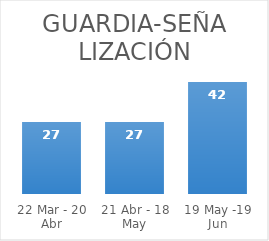
| Category | Series 0 |
|---|---|
| 22 Mar - 20 Abr | 27 |
| 21 Abr - 18 May | 27 |
| 19 May -19 Jun | 42 |